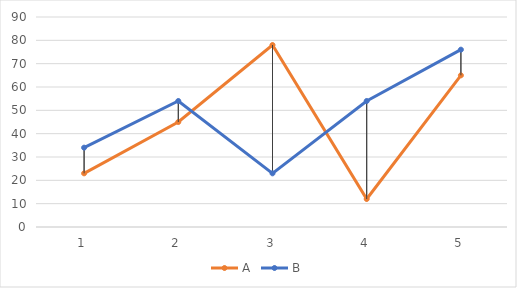
| Category | A | B |
|---|---|---|
| 0 | 23 | 34 |
| 1 | 45 | 54 |
| 2 | 78 | 23 |
| 3 | 12 | 54 |
| 4 | 65 | 76 |